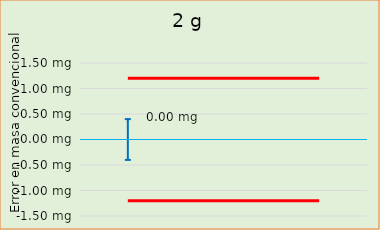
| Category | Error en masa convencional  |  ± EMP |
|---|---|---|
| 0 |  | -1.2 |
| 1 |  | -1.2 |
| 2 |  | -1.2 |